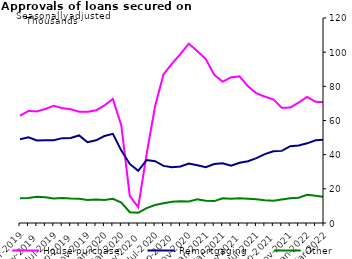
| Category | House purchase | Remortgaging | Other |
|---|---|---|---|
| Mar-2019 | 62835 | 49033 | 14417 |
| Apr-2019 | 65567 | 50135 | 14676 |
| May-2019 | 65309 | 48290 | 15313 |
| Jun-2019 | 66770 | 48404 | 15066 |
| Jul-2019 | 68601 | 48440 | 14325 |
| Aug-2019 | 67219 | 49667 | 14649 |
| Sep-2019 | 66593 | 49816 | 14309 |
| Oct-2019 | 65117 | 51248 | 14218 |
| Nov-2019 | 65062 | 47260 | 13449 |
| Dec-2019 | 65953 | 48394 | 13797 |
| Jan-2020 | 68823 | 50899 | 13506 |
| Feb-2020 | 72610 | 52189 | 14188 |
| Mar-2020 | 57066 | 42377 | 11947 |
| Apr-2020 | 15802 | 34576 | 6310 |
| May-2020 | 9292 | 30529 | 6035 |
| Jun-2020 | 40522 | 36884 | 8719 |
| Jul-2020 | 68472 | 36174 | 10496 |
| Aug-2020 | 87101 | 33434 | 11606 |
| Sep-2020 | 93269 | 32639 | 12393 |
| Oct-2020 | 98964 | 33123 | 12699 |
| Nov-2020 | 104985 | 34849 | 12614 |
| Dec-2020 | 100605 | 33765 | 13950 |
| Jan-2021 | 95982 | 32717 | 13025 |
| Feb-2021 | 86771 | 34525 | 12832 |
| Mar-2021 | 82717 | 34916 | 14474 |
| Apr-2021 | 85268 | 33530 | 14181 |
| May-2021 | 85836 | 35240 | 14463 |
| Jun-2021 | 80014 | 36167 | 14173 |
| Jul-2021 | 75917 | 37953 | 13869 |
| Aug-2021 | 73962 | 40291 | 13386 |
| Sep-2021 | 72351 | 41989 | 13074 |
| Oct-2021 | 67452 | 42218 | 13737 |
| Nov-2021 | 67568 | 44955 | 14422 |
| Dec-2021 | 70551 | 45347 | 14804 |
| Jan-2022 | 73815 | 46639 | 16485 |
| Feb-2022 | 70968 | 48408 | 15966 |
| Mar-2022 | 70691 | 48764 | 15267 |